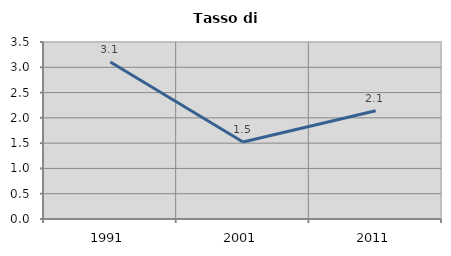
| Category | Tasso di disoccupazione   |
|---|---|
| 1991.0 | 3.106 |
| 2001.0 | 1.523 |
| 2011.0 | 2.141 |